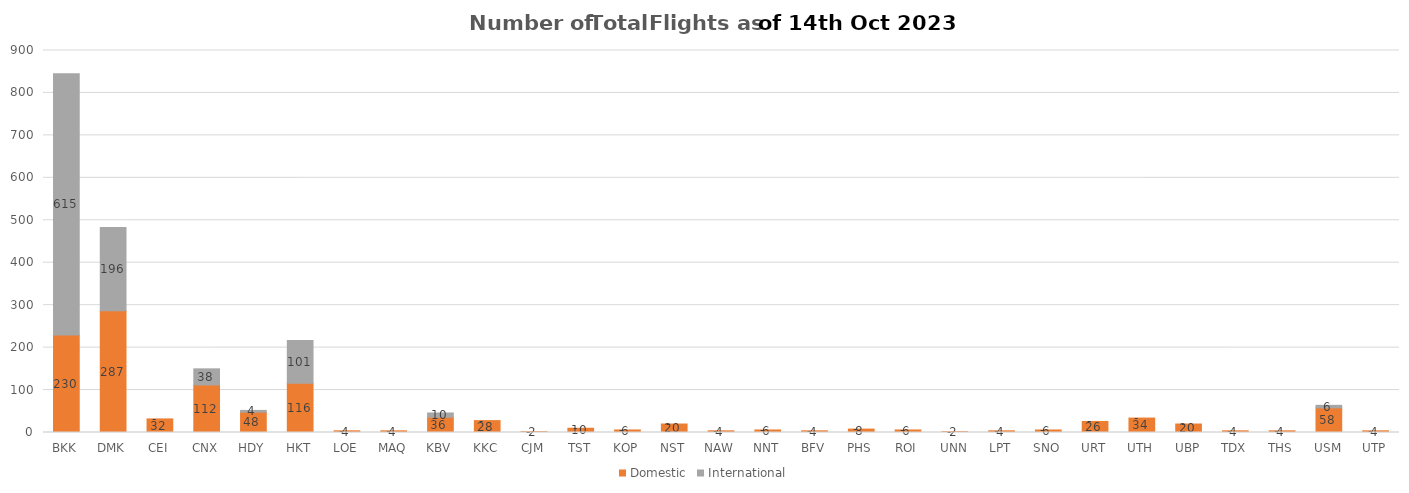
| Category | Domestic | International |
|---|---|---|
| BKK | 230 | 615 |
| DMK | 287 | 196 |
| CEI | 32 | 0 |
| CNX | 112 | 38 |
| HDY | 48 | 4 |
| HKT | 116 | 101 |
| LOE | 4 | 0 |
| MAQ | 4 | 0 |
| KBV | 36 | 10 |
| KKC | 28 | 0 |
| CJM | 2 | 0 |
| TST | 10 | 0 |
| KOP | 6 | 0 |
| NST | 20 | 0 |
| NAW | 4 | 0 |
| NNT | 6 | 0 |
| BFV | 4 | 0 |
| PHS | 8 | 0 |
| ROI | 6 | 0 |
| UNN | 2 | 0 |
| LPT | 4 | 0 |
| SNO | 6 | 0 |
| URT | 26 | 0 |
| UTH | 34 | 0 |
| UBP | 20 | 0 |
| TDX | 4 | 0 |
| THS | 4 | 0 |
| USM | 58 | 6 |
| UTP | 4 | 0 |